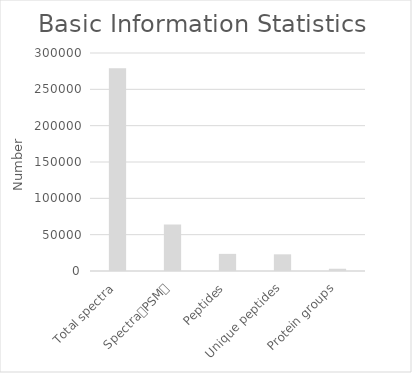
| Category | Series 0 |
|---|---|
| Total spectra | 279080 |
| Spectra（PSM） | 63965 |
| Peptides | 23546 |
| Unique peptides | 22946 |
| Protein groups | 3109 |